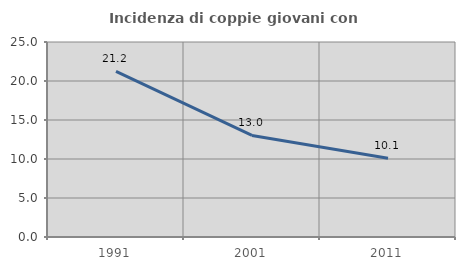
| Category | Incidenza di coppie giovani con figli |
|---|---|
| 1991.0 | 21.229 |
| 2001.0 | 13.025 |
| 2011.0 | 10.089 |